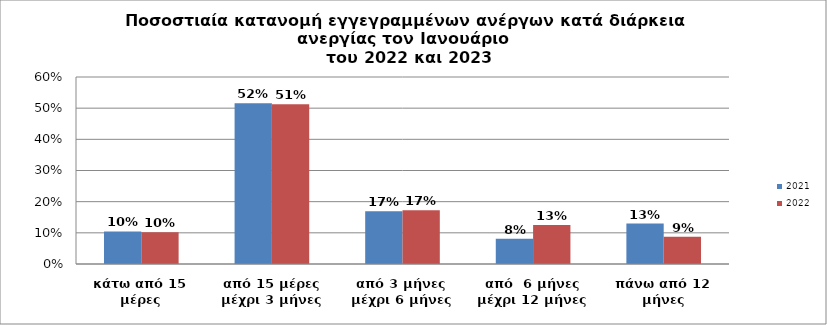
| Category | 2021 | 2022 |
|---|---|---|
| κάτω από 15 μέρες | 0.105 | 0.102 |
| από 15 μέρες μέχρι 3 μήνες | 0.516 | 0.513 |
| από 3 μήνες μέχρι 6 μήνες | 0.169 | 0.173 |
| από  6 μήνες μέχρι 12 μήνες | 0.081 | 0.125 |
| πάνω από 12 μήνες | 0.13 | 0.088 |